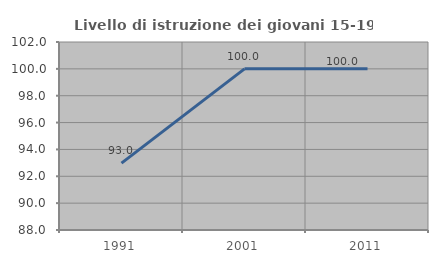
| Category | Livello di istruzione dei giovani 15-19 anni |
|---|---|
| 1991.0 | 92.982 |
| 2001.0 | 100 |
| 2011.0 | 100 |